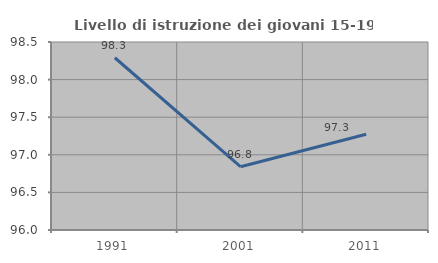
| Category | Livello di istruzione dei giovani 15-19 anni |
|---|---|
| 1991.0 | 98.291 |
| 2001.0 | 96.842 |
| 2011.0 | 97.273 |